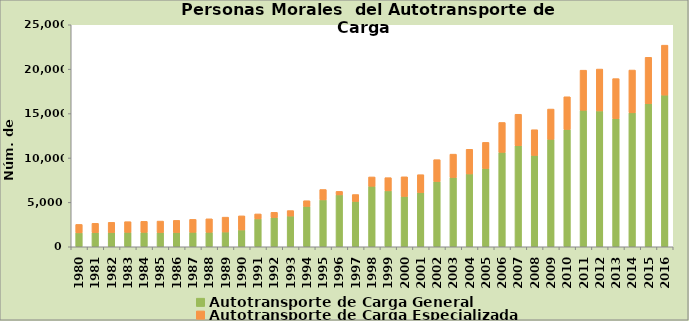
| Category | Autotransporte de Carga General | Autotransporte de Carga Especializada |
|---|---|---|
| 1980.0 | 1569 | 949 |
| 1981.0 | 1596 | 1046 |
| 1982.0 | 1602 | 1150 |
| 1983.0 | 1627 | 1200 |
| 1984.0 | 1626 | 1239 |
| 1985.0 | 1606 | 1289 |
| 1986.0 | 1609 | 1366 |
| 1987.0 | 1631 | 1456 |
| 1988.0 | 1633 | 1516 |
| 1989.0 | 1662 | 1675 |
| 1990.0 | 1892 | 1590 |
| 1991.0 | 3137 | 563 |
| 1992.0 | 3290 | 590 |
| 1993.0 | 3459 | 617 |
| 1994.0 | 4545 | 642 |
| 1995.0 | 5278 | 1171 |
| 1996.0 | 5841 | 398 |
| 1997.0 | 5107 | 776 |
| 1998.0 | 6812 | 1052 |
| 1999.0 | 6297 | 1486 |
| 2000.0 | 5669 | 2211 |
| 2001.0 | 6101 | 2017 |
| 2002.0 | 7351 | 2459 |
| 2003.0 | 7805 | 2627 |
| 2004.0 | 8202 | 2776 |
| 2005.0 | 8815 | 2943 |
| 2006.0 | 10632 | 3366 |
| 2007.0 | 11373 | 3550 |
| 2008.0 | 10287 | 2894 |
| 2009.0 | 12098 | 3412 |
| 2010.0 | 13210 | 3682 |
| 2011.0 | 15370 | 4517 |
| 2012.0 | 15298 | 4716 |
| 2013.0 | 14416 | 4521 |
| 2014.0 | 15084 | 4819 |
| 2015.0 | 16109 | 5228 |
| 2016.0 | 17082 | 5622 |